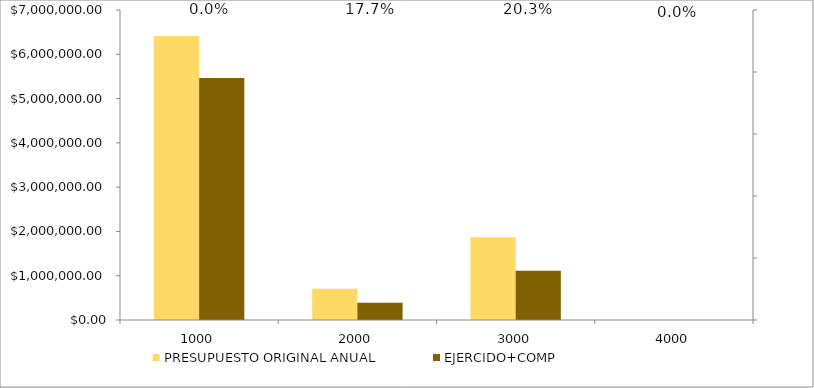
| Category | PRESUPUESTO ORIGINAL ANUAL | EJERCIDO+COMP |
|---|---|---|
| 1000.0 | 6413458 | 5463577.43 |
| 2000.0 | 707508 | 388305.82 |
| 3000.0 | 1868411 | 1110477.27 |
| 4000.0 | 0 | 0 |